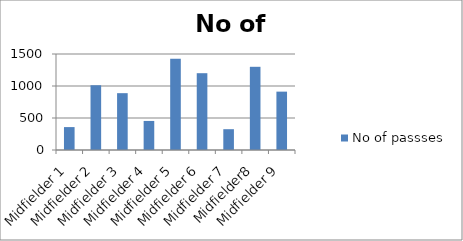
| Category | No of passses |
|---|---|
| Midfielder 1 | 358 |
| Midfielder 2 | 1012 |
| Midfielder 3 | 888 |
| Midfielder 4 | 454 |
| Midfielder 5 | 1424 |
| Midfielder 6 | 1200 |
| Midfielder 7 | 325 |
| Midfielder8 | 1300 |
| Midfielder 9 | 912 |